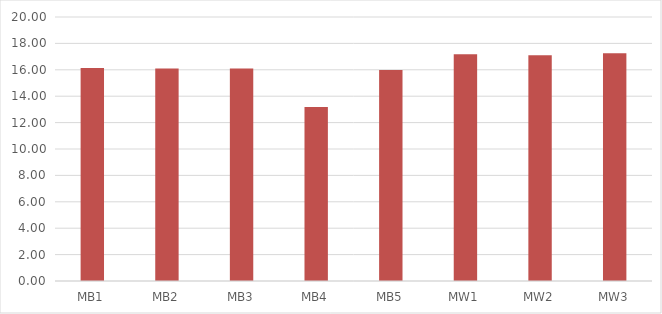
| Category | Series 0 |
|---|---|
| MB1 | 16.14 |
| MB2 | 16.1 |
| MB3 | 16.1 |
| MB4 | 13.19 |
| MB5 | 15.98 |
| MW1 | 17.17 |
| MW2 | 17.1 |
| MW3 | 17.25 |